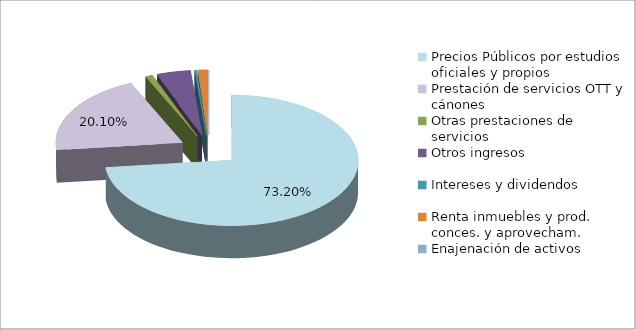
| Category | IMPORTE  |
|---|---|
| Precios Públicos por estudios oficiales y propios | 63834266.47 |
| Prestación de servicios OTT y cánones  | 17530284.08 |
| Otras prestaciones de servicios | 787633.03 |
| Otros ingresos  | 3769314.02 |
| Intereses y dividendos | 182591.35 |
| Renta inmuebles y prod. conces. y aprovecham. | 1093247.21 |
| Enajenación de activos | 7166.06 |